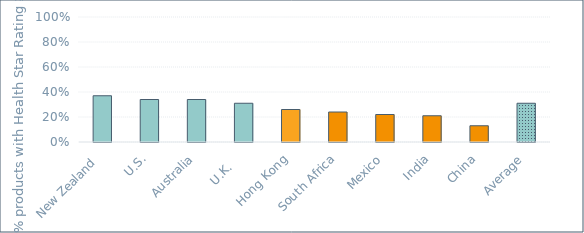
| Category | Series 0 |
|---|---|
| New Zealand  | 0.37 |
| U.S. | 0.34 |
| Australia | 0.34 |
| U.K.    | 0.31 |
| Hong Kong | 0.26 |
| South Africa | 0.24 |
| Mexico | 0.22 |
| India | 0.21 |
| China | 0.13 |
| Average | 0.31 |